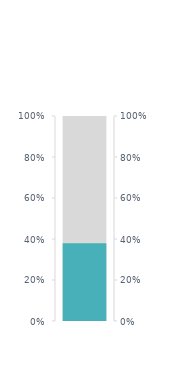
| Category | TřebaZhubnout |
|---|---|
| 0 | 13.2 |